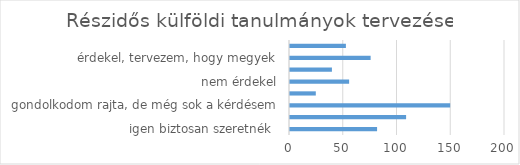
| Category | Series 0 |
|---|---|
|  igen biztosan szeretnék  | 81 |
| még nem tudom, nem foglalkoztam vele | 108 |
| gondolkodom rajta, de még sok a kérdésem | 149 |
| nem, nincs nyelvtudásom | 24 |
| nem érdekel | 55 |
| nem ismerem a lehetőségeket | 39 |
| érdekel, tervezem, hogy megyek | 75 |
| biztos nem megyek | 52 |